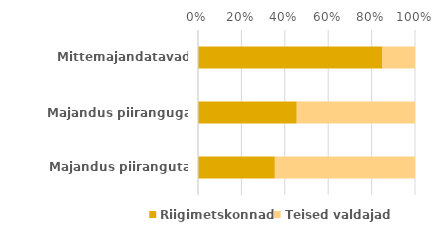
| Category | Riigimetskonnad | Teised valdajad |
|---|---|---|
| Mittemajandatavad metsad | 365.047 | 64.563 |
| Majandus piiranguga metsad | 140.389 | 168.065 |
| Majandus piiranguta metsad | 565.308 | 1030.805 |